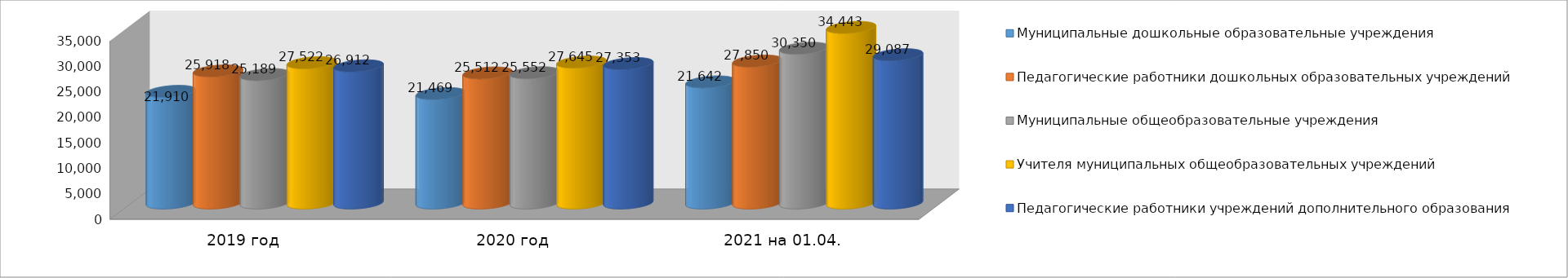
| Category | Муниципальные дошкольные образовательные учреждения | Педагогические работники дошкольных образовательных учреждений | Муниципальные общеобразовательные учреждения | Учителя муниципальных общеобразовательных учреждений | Педагогические работники учреждений дополнительного образования |
|---|---|---|---|---|---|
| 2019 год | 21910 | 25918 | 25189 | 27522 | 26912 |
| 2020 год | 21469 | 25512 | 25552 | 27645 | 27353 |
| 2021 на 01.04. | 23757 | 27850 | 30350 | 34443 | 29087 |